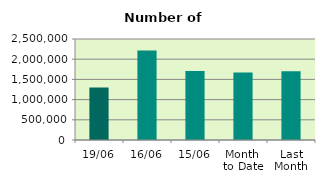
| Category | Series 0 |
|---|---|
| 19/06 | 1298602 |
| 16/06 | 2214694 |
| 15/06 | 1707264 |
| Month 
to Date | 1669702.308 |
| Last
Month | 1704183.636 |